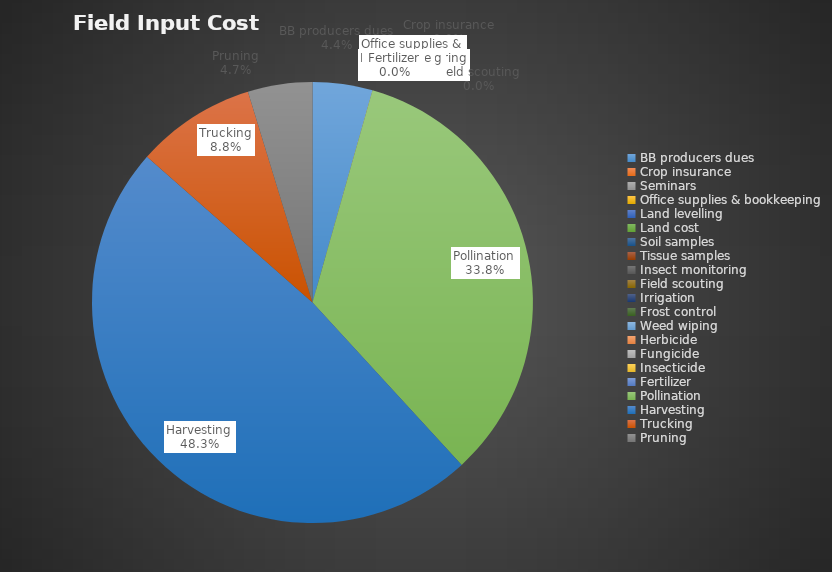
| Category | Series 0 |
|---|---|
| BB producers dues | 4.392 |
| Crop insurance | 0 |
| Seminars  | 0 |
| Office supplies & bookkeeping | 0 |
| Land levelling  | 0 |
| Land cost | 0 |
| Soil samples | 0 |
| Tissue samples | 0 |
| Insect monitoring | 0 |
| Field scouting | 0 |
| Irrigation | 0 |
| Frost control | 0 |
| Weed wiping | 0 |
| Herbicide | 0 |
| Fungicide | 0 |
| Insecticide | 0 |
| Fertilizer | 0 |
| Pollination | 33.784 |
| Harvesting | 48.311 |
| Trucking | 8.784 |
| Pruning | 4.73 |